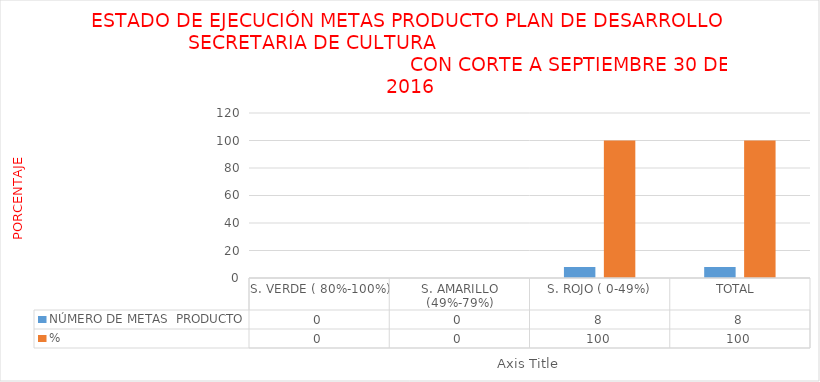
| Category | NÚMERO DE METAS  PRODUCTO  | % |
|---|---|---|
| S. VERDE ( 80%-100%)  | 0 | 0 |
| S. AMARILLO (49%-79%) | 0 | 0 |
| S. ROJO ( 0-49%) | 8 | 100 |
| TOTAL  | 8 | 100 |